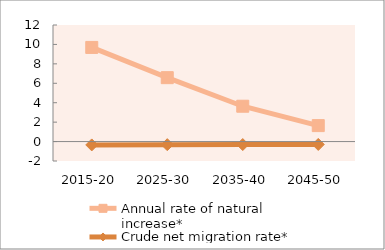
| Category | Annual rate of natural increase* | Crude net migration rate* |
|---|---|---|
| 2015-20 | 9.691 | -0.345 |
| 2025-30 | 6.578 | -0.319 |
| 2035-40 | 3.639 | -0.305 |
| 2045-50 | 1.644 | -0.298 |